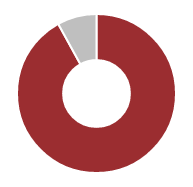
| Category | Health Ins |
|---|---|
| 0 | 0.92 |
| 1 | 0.08 |